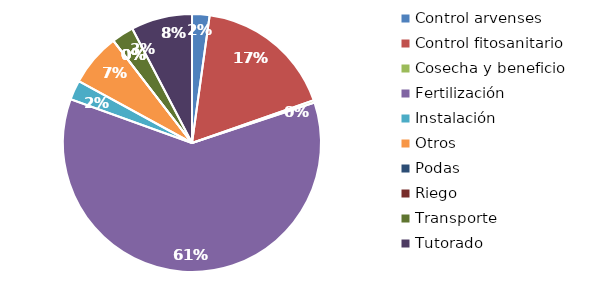
| Category | Valor |
|---|---|
| Control arvenses | 858000 |
| Control fitosanitario | 6820000 |
| Cosecha y beneficio | 120000 |
| Fertilización | 23718000 |
| Instalación | 955000 |
| Otros | 2590000 |
| Podas | 0 |
| Riego | 0 |
| Transporte | 1085000 |
| Tutorado | 3000000 |